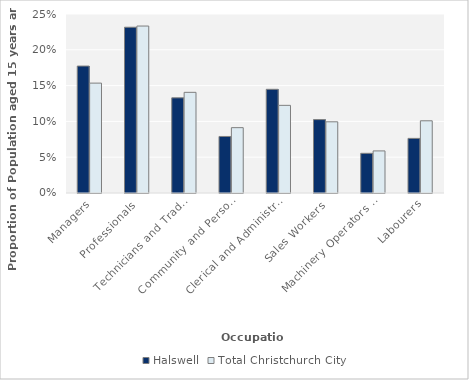
| Category | Halswell | Total Christchurch City |
|---|---|---|
| Managers | 0.177 | 0.153 |
| Professionals | 0.232 | 0.233 |
| Technicians and Trades Workers | 0.133 | 0.141 |
| Community and Personal Service Workers | 0.079 | 0.091 |
| Clerical and Administrative Workers | 0.145 | 0.122 |
| Sales Workers | 0.103 | 0.099 |
| Machinery Operators and Drivers | 0.055 | 0.059 |
| Labourers | 0.076 | 0.101 |